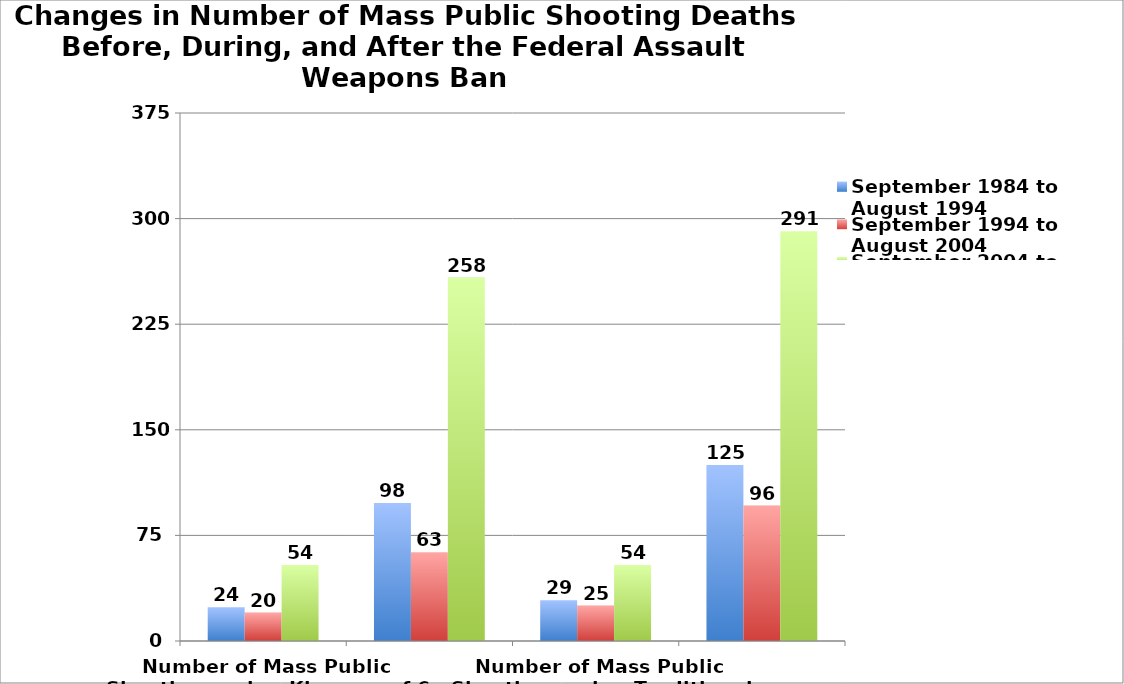
| Category | September 1984 to August 1994 | September 1994 to August 2004 | September 2004 to August 2014 |
|---|---|---|---|
| Number of Mass Public Shootings using Klaveras of 6 or more killed | 24 | 20 | 54 |
|  | 98 | 63 | 258 |
| Number of Mass Public Shootings using Traditional FBI Definition of 4 or more killed | 29 | 25 | 54 |
|  | 125 | 96 | 291 |